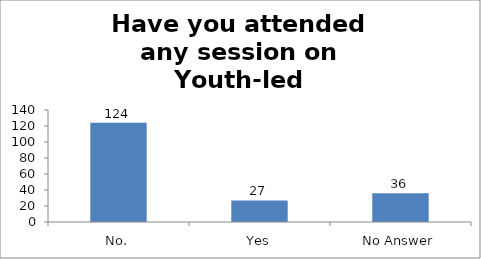
| Category | Have you attended any session on Youth-led Changemaking before? |
|---|---|
| No. | 124 |
| Yes | 27 |
| No Answer | 36 |